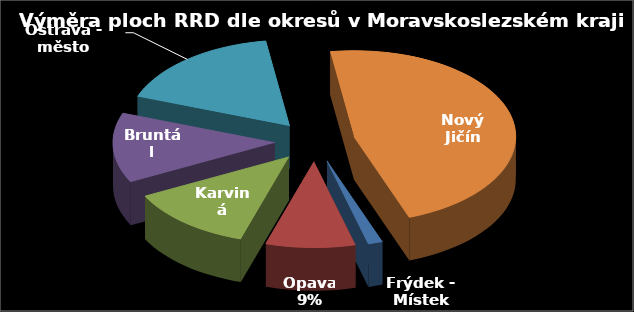
| Category | Výměra [ha] |
|---|---|
| Frýdek - Místek | 2.76 |
| Opava | 17.15 |
| Karviná | 24.29 |
| Bruntál | 25.22 |
| Ostrava - město | 32.76 |
| Nový Jičín | 89.88 |